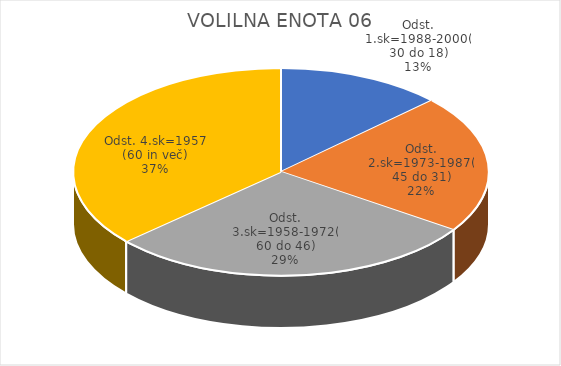
| Category | VOLILNA ENOTA 06 |
|---|---|
| Odst. 1.sk=1988-2000(30 do 18) | 6.41 |
| Odst. 2.sk=1973-1987(45 do 31) | 10.68 |
| Odst. 3.sk=1958-1972(60 do 46) | 14.34 |
| Odst. 4.sk=1957 (60 in več) | 18.18 |